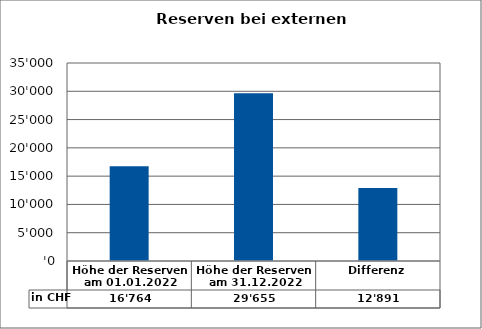
| Category | in CHF |
|---|---|
| Höhe der Reserven am 01.01.2022 | 16764 |
| Höhe der Reserven am 31.12.2022 | 29655 |
| Differenz | 12891 |